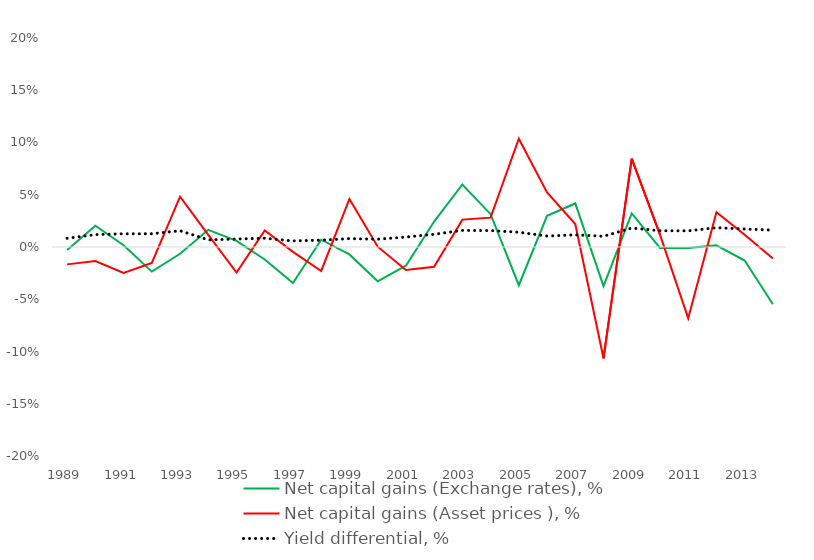
| Category | Net capital gains (Exchange rates), % | Net capital gains (Asset prices ), % | Yield differential, % |
|---|---|---|---|
| 1989.0 | -0.003 | -0.017 | 0.008 |
| 1990.0 | 0.02 | -0.013 | 0.012 |
| 1991.0 | 0.002 | -0.025 | 0.013 |
| 1992.0 | -0.024 | -0.015 | 0.013 |
| 1993.0 | -0.007 | 0.048 | 0.016 |
| 1994.0 | 0.016 | 0.012 | 0.007 |
| 1995.0 | 0.006 | -0.025 | 0.008 |
| 1996.0 | -0.012 | 0.016 | 0.008 |
| 1997.0 | -0.035 | -0.005 | 0.006 |
| 1998.0 | 0.007 | -0.023 | 0.007 |
| 1999.0 | -0.007 | 0.046 | 0.008 |
| 2000.0 | -0.033 | 0 | 0.007 |
| 2001.0 | -0.018 | -0.022 | 0.01 |
| 2002.0 | 0.024 | -0.019 | 0.012 |
| 2003.0 | 0.06 | 0.026 | 0.016 |
| 2004.0 | 0.031 | 0.028 | 0.016 |
| 2005.0 | -0.037 | 0.104 | 0.014 |
| 2006.0 | 0.03 | 0.052 | 0.01 |
| 2007.0 | 0.042 | 0.022 | 0.012 |
| 2008.0 | -0.037 | -0.106 | 0.01 |
| 2009.0 | 0.032 | 0.084 | 0.018 |
| 2010.0 | -0.001 | 0.012 | 0.016 |
| 2011.0 | -0.001 | -0.068 | 0.015 |
| 2012.0 | 0.002 | 0.033 | 0.018 |
| 2013.0 | -0.013 | 0.012 | 0.017 |
| 2014.0 | -0.055 | -0.011 | 0.016 |